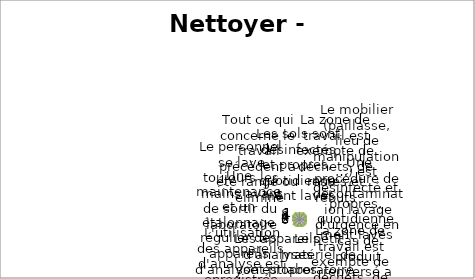
| Category | Series 2 |
|---|---|
| Les sols sont désinfectés et propres, quotidiennement lavés | 5 |
| La zone de travail est exempte de déchets, de restes et rebuts | 10 |
| Le mobilier (paillasse, lieu de manipulation…) est désinfecté et propres, quotidiennement lavés | 10 |
| Une procédure de décontamination lavage d'urgence en cas de produit renversé a été mise en place | 10 |
| La zone de travail est exempte de déchets, de restes et rebuts | 10 |
| Le petit matériel de laboratoire est lavée et désinfectée après chaque utilisation | 10 |
| Les appareils d'analyses sont propres | 10 |
| L'utilisation des appareils d'analyse est enregistrée | 10 |
| Une maintenance et un étalonnage régulier des appareils d'analyse est organisé | 5 |
| Le personnel se lave toujours les mains avant de sortir du laboratoire | 10 |
| Tout ce qui concerne le travail précédent a été rangé ou éliminé | 10 |